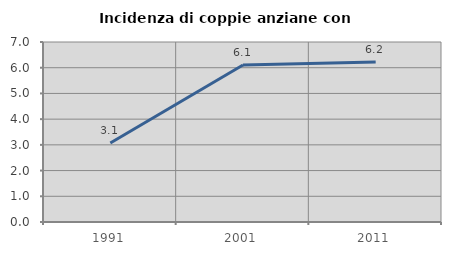
| Category | Incidenza di coppie anziane con figli |
|---|---|
| 1991.0 | 3.07 |
| 2001.0 | 6.103 |
| 2011.0 | 6.22 |